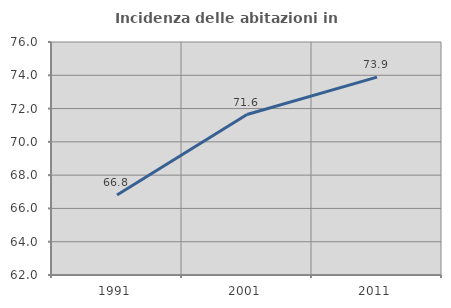
| Category | Incidenza delle abitazioni in proprietà  |
|---|---|
| 1991.0 | 66.806 |
| 2001.0 | 71.643 |
| 2011.0 | 73.89 |